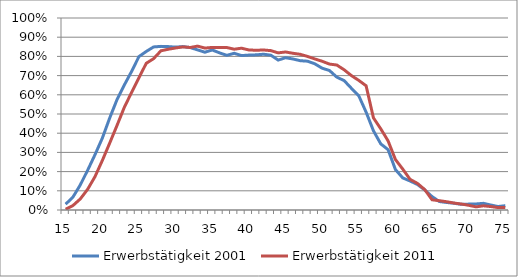
| Category | Erwerbstätigkeit 2001 | Erwerbstätigkeit 2011 |
|---|---|---|
| 15.0 | 0.03 | 0.004 |
| 16.0 | 0.068 | 0.023 |
| 17.0 | 0.131 | 0.058 |
| 18.0 | 0.207 | 0.108 |
| 19.0 | 0.288 | 0.174 |
| 20.0 | 0.374 | 0.258 |
| 21.0 | 0.478 | 0.348 |
| 22.0 | 0.574 | 0.44 |
| 23.0 | 0.651 | 0.534 |
| 24.0 | 0.722 | 0.613 |
| 25.0 | 0.799 | 0.689 |
| 26.0 | 0.826 | 0.764 |
| 27.0 | 0.849 | 0.788 |
| 28.0 | 0.852 | 0.829 |
| 29.0 | 0.851 | 0.837 |
| 30.0 | 0.848 | 0.844 |
| 31.0 | 0.851 | 0.849 |
| 32.0 | 0.846 | 0.846 |
| 33.0 | 0.834 | 0.853 |
| 34.0 | 0.822 | 0.843 |
| 35.0 | 0.833 | 0.847 |
| 36.0 | 0.818 | 0.846 |
| 37.0 | 0.806 | 0.846 |
| 38.0 | 0.816 | 0.837 |
| 39.0 | 0.804 | 0.843 |
| 40.0 | 0.807 | 0.834 |
| 41.0 | 0.808 | 0.832 |
| 42.0 | 0.811 | 0.833 |
| 43.0 | 0.806 | 0.83 |
| 44.0 | 0.781 | 0.818 |
| 45.0 | 0.793 | 0.823 |
| 46.0 | 0.787 | 0.816 |
| 47.0 | 0.778 | 0.811 |
| 48.0 | 0.775 | 0.8 |
| 49.0 | 0.762 | 0.787 |
| 50.0 | 0.739 | 0.775 |
| 51.0 | 0.727 | 0.76 |
| 52.0 | 0.692 | 0.755 |
| 53.0 | 0.674 | 0.73 |
| 54.0 | 0.634 | 0.7 |
| 55.0 | 0.595 | 0.675 |
| 56.0 | 0.51 | 0.647 |
| 57.0 | 0.413 | 0.48 |
| 58.0 | 0.344 | 0.423 |
| 59.0 | 0.314 | 0.36 |
| 60.0 | 0.211 | 0.263 |
| 61.0 | 0.167 | 0.213 |
| 62.0 | 0.151 | 0.16 |
| 63.0 | 0.133 | 0.139 |
| 64.0 | 0.105 | 0.106 |
| 65.0 | 0.07 | 0.053 |
| 66.0 | 0.044 | 0.048 |
| 67.0 | 0.039 | 0.043 |
| 68.0 | 0.035 | 0.036 |
| 69.0 | 0.029 | 0.031 |
| 70.0 | 0.031 | 0.024 |
| 71.0 | 0.031 | 0.016 |
| 72.0 | 0.035 | 0.022 |
| 73.0 | 0.026 | 0.018 |
| 74.0 | 0.018 | 0.013 |
| 75.0 | 0.022 | 0.012 |